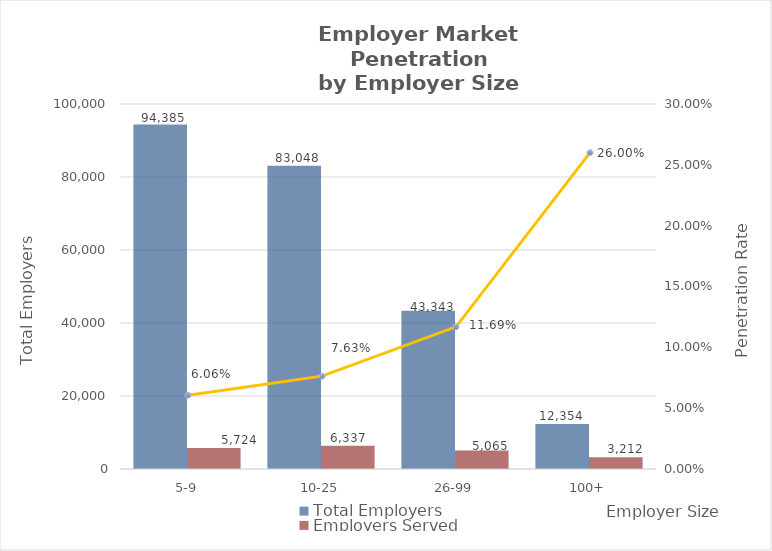
| Category | Total Employers | Employers Served |
|---|---|---|
| 5-9 | 94385 | 5724 |
| 10-25 | 83048 | 6337 |
| 26-99 | 43343 | 5065 |
| 100+ | 12354 | 3212 |